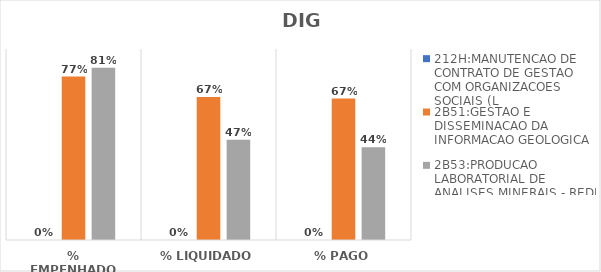
| Category | 212H:MANUTENCAO DE CONTRATO DE GESTAO COM ORGANIZACOES SOCIAIS (L | 2B51:GESTAO E DISSEMINACAO DA INFORMACAO GEOLOGICA | 2B53:PRODUCAO LABORATORIAL DE ANALISES MINERAIS - REDE LAMIN |
|---|---|---|---|
| % EMPENHADO | 0 | 0.77 | 0.811 |
| % LIQUIDADO | 0 | 0.673 | 0.472 |
| % PAGO | 0 | 0.666 | 0.437 |